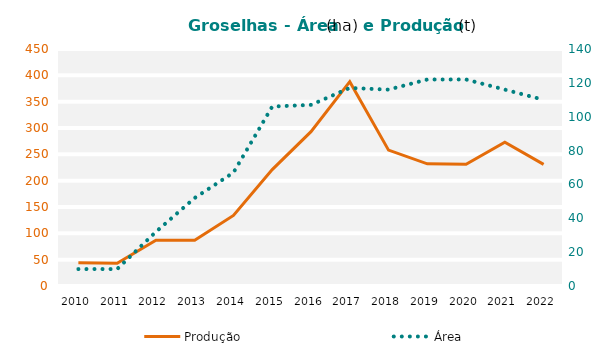
| Category | Produção |
|---|---|
| 2010 | 44 |
| 2011 | 43 |
| 2012 | 87 |
| 2013 | 87 |
| 2014 | 134 |
| 2015 | 221 |
| 2016 | 293 |
| 2017 | 388 |
| 2018 | 258 |
| 2019 | 232 |
| 2020 | 231 |
| 2021 | 273 |
| 2022 | 231 |